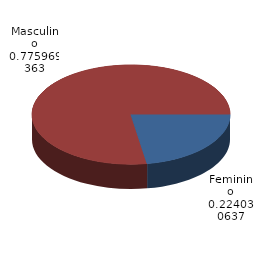
| Category | Qtde Vítimas |
|---|---|
| Feminino | 468 |
| Masculino | 1621 |